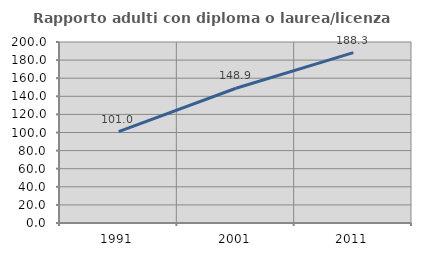
| Category | Rapporto adulti con diploma o laurea/licenza media  |
|---|---|
| 1991.0 | 100.985 |
| 2001.0 | 148.919 |
| 2011.0 | 188.33 |